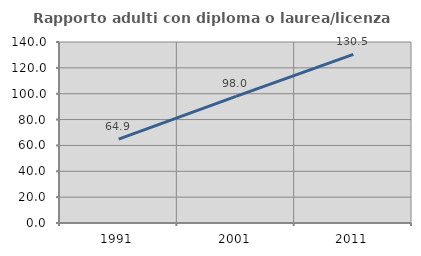
| Category | Rapporto adulti con diploma o laurea/licenza media  |
|---|---|
| 1991.0 | 64.865 |
| 2001.0 | 97.973 |
| 2011.0 | 130.488 |